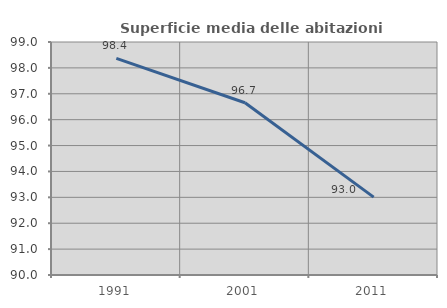
| Category | Superficie media delle abitazioni occupate |
|---|---|
| 1991.0 | 98.369 |
| 2001.0 | 96.652 |
| 2011.0 | 93.009 |